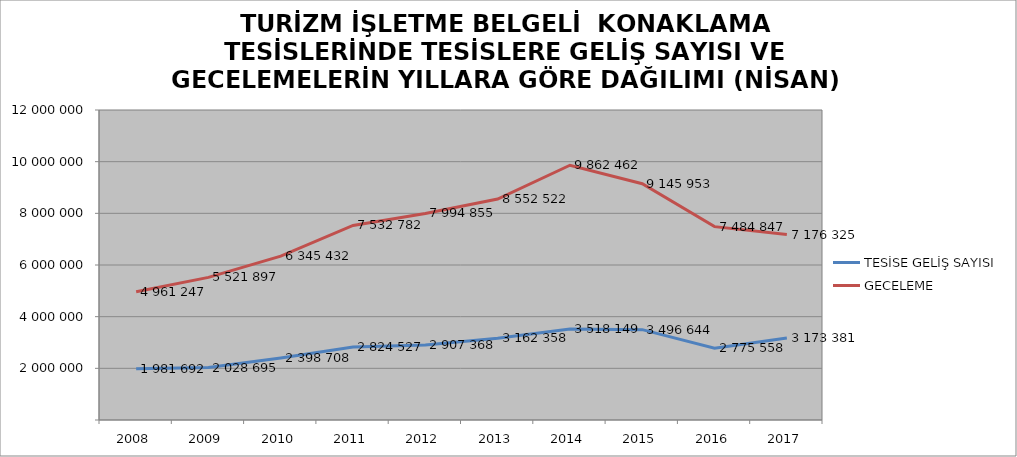
| Category | TESİSE GELİŞ SAYISI | GECELEME |
|---|---|---|
| 2008 | 1981692 | 4961247 |
| 2009 | 2028695 | 5521897 |
| 2010 | 2398708 | 6345432 |
| 2011 | 2824527 | 7532782 |
| 2012 | 2907368 | 7994855 |
| 2013 | 3162358 | 8552522 |
| 2014 | 3518149 | 9862462 |
| 2015 | 3496644 | 9145953 |
| 2016 | 2775558 | 7484847 |
| 2017 | 3173381 | 7176325 |